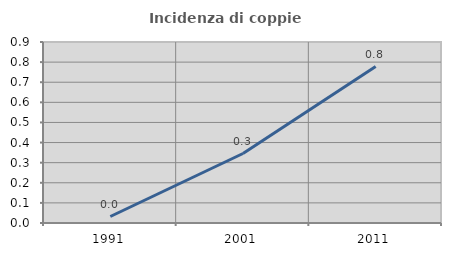
| Category | Incidenza di coppie miste |
|---|---|
| 1991.0 | 0.032 |
| 2001.0 | 0.346 |
| 2011.0 | 0.778 |